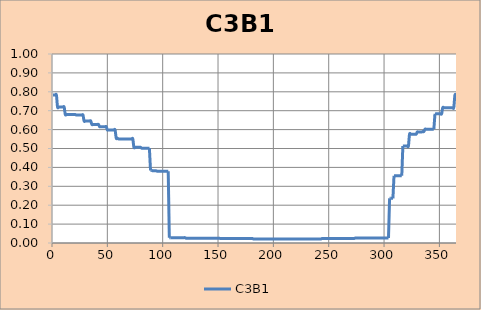
| Category | C3B1 |
|---|---|
| 1.0 | 0.783 |
| 2.0 | 0.783 |
| 3.0 | 0.783 |
| 4.0 | 0.783 |
| 5.0 | 0.719 |
| 6.0 | 0.719 |
| 7.0 | 0.719 |
| 8.0 | 0.719 |
| 9.0 | 0.719 |
| 10.0 | 0.719 |
| 11.0 | 0.719 |
| 12.0 | 0.68 |
| 13.0 | 0.68 |
| 14.0 | 0.68 |
| 15.0 | 0.68 |
| 16.0 | 0.68 |
| 17.0 | 0.68 |
| 18.0 | 0.68 |
| 19.0 | 0.68 |
| 20.0 | 0.68 |
| 21.0 | 0.68 |
| 22.0 | 0.677 |
| 23.0 | 0.677 |
| 24.0 | 0.677 |
| 25.0 | 0.677 |
| 26.0 | 0.677 |
| 27.0 | 0.677 |
| 28.0 | 0.677 |
| 29.0 | 0.645 |
| 30.0 | 0.645 |
| 31.0 | 0.645 |
| 32.0 | 0.646 |
| 33.0 | 0.646 |
| 34.0 | 0.646 |
| 35.0 | 0.646 |
| 36.0 | 0.627 |
| 37.0 | 0.627 |
| 38.0 | 0.627 |
| 39.0 | 0.627 |
| 40.0 | 0.627 |
| 41.0 | 0.627 |
| 42.0 | 0.627 |
| 43.0 | 0.615 |
| 44.0 | 0.615 |
| 45.0 | 0.615 |
| 46.0 | 0.615 |
| 47.0 | 0.615 |
| 48.0 | 0.615 |
| 49.0 | 0.615 |
| 50.0 | 0.598 |
| 51.0 | 0.598 |
| 52.0 | 0.598 |
| 53.0 | 0.598 |
| 54.0 | 0.598 |
| 55.0 | 0.598 |
| 56.0 | 0.598 |
| 57.0 | 0.598 |
| 58.0 | 0.555 |
| 59.0 | 0.555 |
| 60.0 | 0.551 |
| 61.0 | 0.551 |
| 62.0 | 0.551 |
| 63.0 | 0.551 |
| 64.0 | 0.551 |
| 65.0 | 0.551 |
| 66.0 | 0.551 |
| 67.0 | 0.551 |
| 68.0 | 0.551 |
| 69.0 | 0.551 |
| 70.0 | 0.551 |
| 71.0 | 0.551 |
| 72.0 | 0.551 |
| 73.0 | 0.551 |
| 74.0 | 0.506 |
| 75.0 | 0.506 |
| 76.0 | 0.506 |
| 77.0 | 0.506 |
| 78.0 | 0.506 |
| 79.0 | 0.506 |
| 80.0 | 0.506 |
| 81.0 | 0.502 |
| 82.0 | 0.502 |
| 83.0 | 0.502 |
| 84.0 | 0.502 |
| 85.0 | 0.502 |
| 86.0 | 0.502 |
| 87.0 | 0.502 |
| 88.0 | 0.502 |
| 89.0 | 0.384 |
| 90.0 | 0.384 |
| 91.0 | 0.382 |
| 92.0 | 0.382 |
| 93.0 | 0.382 |
| 94.0 | 0.382 |
| 95.0 | 0.38 |
| 96.0 | 0.38 |
| 97.0 | 0.38 |
| 98.0 | 0.38 |
| 99.0 | 0.38 |
| 100.0 | 0.38 |
| 101.0 | 0.38 |
| 102.0 | 0.38 |
| 103.0 | 0.38 |
| 104.0 | 0.38 |
| 105.0 | 0.38 |
| 106.0 | 0.028 |
| 107.0 | 0.028 |
| 108.0 | 0.028 |
| 109.0 | 0.028 |
| 110.0 | 0.028 |
| 111.0 | 0.028 |
| 112.0 | 0.028 |
| 113.0 | 0.028 |
| 114.0 | 0.028 |
| 115.0 | 0.028 |
| 116.0 | 0.028 |
| 117.0 | 0.028 |
| 118.0 | 0.028 |
| 119.0 | 0.028 |
| 120.0 | 0.028 |
| 121.0 | 0.025 |
| 122.0 | 0.025 |
| 123.0 | 0.025 |
| 124.0 | 0.025 |
| 125.0 | 0.025 |
| 126.0 | 0.025 |
| 127.0 | 0.025 |
| 128.0 | 0.025 |
| 129.0 | 0.025 |
| 130.0 | 0.025 |
| 131.0 | 0.025 |
| 132.0 | 0.025 |
| 133.0 | 0.025 |
| 134.0 | 0.025 |
| 135.0 | 0.025 |
| 136.0 | 0.025 |
| 137.0 | 0.025 |
| 138.0 | 0.025 |
| 139.0 | 0.025 |
| 140.0 | 0.025 |
| 141.0 | 0.025 |
| 142.0 | 0.025 |
| 143.0 | 0.025 |
| 144.0 | 0.025 |
| 145.0 | 0.025 |
| 146.0 | 0.025 |
| 147.0 | 0.025 |
| 148.0 | 0.025 |
| 149.0 | 0.025 |
| 150.0 | 0.025 |
| 151.0 | 0.025 |
| 152.0 | 0.024 |
| 153.0 | 0.024 |
| 154.0 | 0.024 |
| 155.0 | 0.024 |
| 156.0 | 0.024 |
| 157.0 | 0.024 |
| 158.0 | 0.024 |
| 159.0 | 0.024 |
| 160.0 | 0.024 |
| 161.0 | 0.024 |
| 162.0 | 0.024 |
| 163.0 | 0.024 |
| 164.0 | 0.024 |
| 165.0 | 0.024 |
| 166.0 | 0.024 |
| 167.0 | 0.024 |
| 168.0 | 0.024 |
| 169.0 | 0.024 |
| 170.0 | 0.024 |
| 171.0 | 0.024 |
| 172.0 | 0.024 |
| 173.0 | 0.024 |
| 174.0 | 0.024 |
| 175.0 | 0.024 |
| 176.0 | 0.024 |
| 177.0 | 0.024 |
| 178.0 | 0.024 |
| 179.0 | 0.024 |
| 180.0 | 0.024 |
| 181.0 | 0.024 |
| 182.0 | 0.021 |
| 183.0 | 0.021 |
| 184.0 | 0.021 |
| 185.0 | 0.021 |
| 186.0 | 0.021 |
| 187.0 | 0.021 |
| 188.0 | 0.021 |
| 189.0 | 0.021 |
| 190.0 | 0.021 |
| 191.0 | 0.021 |
| 192.0 | 0.021 |
| 193.0 | 0.021 |
| 194.0 | 0.021 |
| 195.0 | 0.021 |
| 196.0 | 0.021 |
| 197.0 | 0.021 |
| 198.0 | 0.021 |
| 199.0 | 0.021 |
| 200.0 | 0.021 |
| 201.0 | 0.021 |
| 202.0 | 0.021 |
| 203.0 | 0.021 |
| 204.0 | 0.021 |
| 205.0 | 0.021 |
| 206.0 | 0.021 |
| 207.0 | 0.021 |
| 208.0 | 0.021 |
| 209.0 | 0.021 |
| 210.0 | 0.021 |
| 211.0 | 0.021 |
| 212.0 | 0.021 |
| 213.0 | 0.021 |
| 214.0 | 0.021 |
| 215.0 | 0.021 |
| 216.0 | 0.021 |
| 217.0 | 0.021 |
| 218.0 | 0.021 |
| 219.0 | 0.021 |
| 220.0 | 0.021 |
| 221.0 | 0.021 |
| 222.0 | 0.021 |
| 223.0 | 0.021 |
| 224.0 | 0.021 |
| 225.0 | 0.021 |
| 226.0 | 0.021 |
| 227.0 | 0.021 |
| 228.0 | 0.021 |
| 229.0 | 0.021 |
| 230.0 | 0.021 |
| 231.0 | 0.021 |
| 232.0 | 0.021 |
| 233.0 | 0.021 |
| 234.0 | 0.021 |
| 235.0 | 0.021 |
| 236.0 | 0.021 |
| 237.0 | 0.021 |
| 238.0 | 0.021 |
| 239.0 | 0.021 |
| 240.0 | 0.021 |
| 241.0 | 0.021 |
| 242.0 | 0.021 |
| 243.0 | 0.021 |
| 244.0 | 0.024 |
| 245.0 | 0.024 |
| 246.0 | 0.024 |
| 247.0 | 0.024 |
| 248.0 | 0.024 |
| 249.0 | 0.024 |
| 250.0 | 0.024 |
| 251.0 | 0.024 |
| 252.0 | 0.024 |
| 253.0 | 0.024 |
| 254.0 | 0.024 |
| 255.0 | 0.024 |
| 256.0 | 0.024 |
| 257.0 | 0.024 |
| 258.0 | 0.024 |
| 259.0 | 0.024 |
| 260.0 | 0.024 |
| 261.0 | 0.024 |
| 262.0 | 0.024 |
| 263.0 | 0.024 |
| 264.0 | 0.024 |
| 265.0 | 0.024 |
| 266.0 | 0.024 |
| 267.0 | 0.024 |
| 268.0 | 0.024 |
| 269.0 | 0.024 |
| 270.0 | 0.024 |
| 271.0 | 0.024 |
| 272.0 | 0.024 |
| 273.0 | 0.024 |
| 274.0 | 0.026 |
| 275.0 | 0.026 |
| 276.0 | 0.026 |
| 277.0 | 0.026 |
| 278.0 | 0.026 |
| 279.0 | 0.026 |
| 280.0 | 0.026 |
| 281.0 | 0.026 |
| 282.0 | 0.026 |
| 283.0 | 0.026 |
| 284.0 | 0.026 |
| 285.0 | 0.026 |
| 286.0 | 0.026 |
| 287.0 | 0.026 |
| 288.0 | 0.026 |
| 289.0 | 0.026 |
| 290.0 | 0.026 |
| 291.0 | 0.026 |
| 292.0 | 0.026 |
| 293.0 | 0.026 |
| 294.0 | 0.026 |
| 295.0 | 0.026 |
| 296.0 | 0.026 |
| 297.0 | 0.026 |
| 298.0 | 0.026 |
| 299.0 | 0.026 |
| 300.0 | 0.026 |
| 301.0 | 0.026 |
| 302.0 | 0.026 |
| 303.0 | 0.026 |
| 304.0 | 0.026 |
| 305.0 | 0.236 |
| 306.0 | 0.236 |
| 307.0 | 0.236 |
| 308.0 | 0.236 |
| 309.0 | 0.356 |
| 310.0 | 0.356 |
| 311.0 | 0.356 |
| 312.0 | 0.356 |
| 313.0 | 0.356 |
| 314.0 | 0.356 |
| 315.0 | 0.356 |
| 316.0 | 0.356 |
| 317.0 | 0.513 |
| 318.0 | 0.513 |
| 319.0 | 0.513 |
| 320.0 | 0.513 |
| 321.0 | 0.513 |
| 322.0 | 0.513 |
| 323.0 | 0.576 |
| 324.0 | 0.576 |
| 325.0 | 0.576 |
| 326.0 | 0.576 |
| 327.0 | 0.576 |
| 328.0 | 0.576 |
| 329.0 | 0.576 |
| 330.0 | 0.587 |
| 331.0 | 0.587 |
| 332.0 | 0.587 |
| 333.0 | 0.587 |
| 334.0 | 0.587 |
| 335.0 | 0.59 |
| 336.0 | 0.59 |
| 337.0 | 0.602 |
| 338.0 | 0.602 |
| 339.0 | 0.602 |
| 340.0 | 0.602 |
| 341.0 | 0.602 |
| 342.0 | 0.602 |
| 343.0 | 0.602 |
| 344.0 | 0.602 |
| 345.0 | 0.602 |
| 346.0 | 0.683 |
| 347.0 | 0.683 |
| 348.0 | 0.683 |
| 349.0 | 0.683 |
| 350.0 | 0.683 |
| 351.0 | 0.683 |
| 352.0 | 0.683 |
| 353.0 | 0.716 |
| 354.0 | 0.716 |
| 355.0 | 0.716 |
| 356.0 | 0.716 |
| 357.0 | 0.716 |
| 358.0 | 0.716 |
| 359.0 | 0.716 |
| 360.0 | 0.716 |
| 361.0 | 0.716 |
| 362.0 | 0.716 |
| 363.0 | 0.716 |
| 364.0 | 0.782 |
| 365.0 | 0.782 |